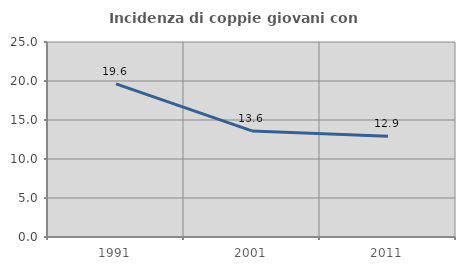
| Category | Incidenza di coppie giovani con figli |
|---|---|
| 1991.0 | 19.623 |
| 2001.0 | 13.598 |
| 2011.0 | 12.911 |